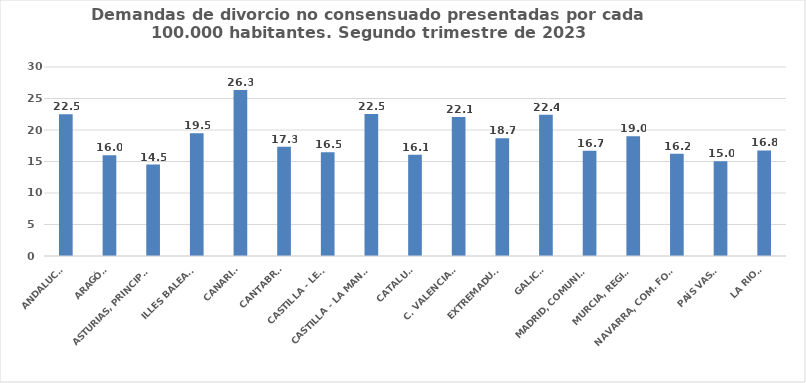
| Category | Series 0 |
|---|---|
| ANDALUCÍA | 22.492 |
| ARAGÓN | 16.008 |
| ASTURIAS, PRINCIPADO | 14.504 |
| ILLES BALEARS | 19.474 |
| CANARIAS | 26.345 |
| CANTABRIA | 17.331 |
| CASTILLA - LEÓN | 16.453 |
| CASTILLA - LA MANCHA | 22.541 |
| CATALUÑA | 16.078 |
| C. VALENCIANA | 22.057 |
| EXTREMADURA | 18.685 |
| GALICIA | 22.41 |
| MADRID, COMUNIDAD | 16.703 |
| MURCIA, REGIÓN | 18.999 |
| NAVARRA, COM. FORAL | 16.215 |
| PAÍS VASCO | 15.046 |
| LA RIOJA | 16.757 |